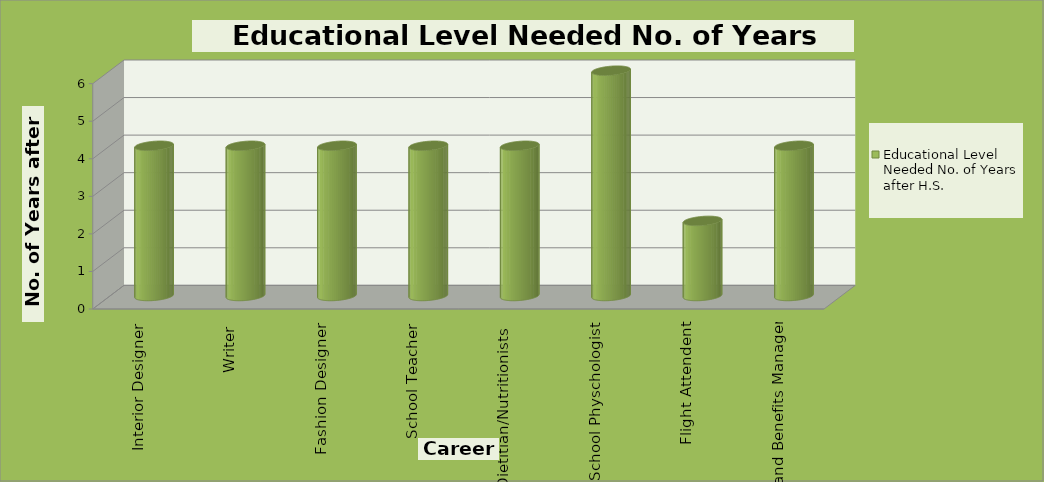
| Category | Educational Level Needed No. of Years after H.S. |
|---|---|
| Interior Designer | 4 |
| Writer | 4 |
| Fashion Designer | 4 |
| School Teacher | 4 |
| Dietitian/Nutritionists  | 4 |
| School Physchologist | 6 |
| Flight Attendent | 2 |
| Compensation and Benefits Manager | 4 |